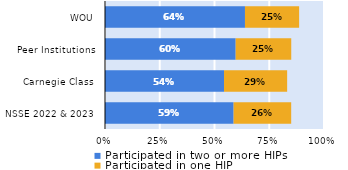
| Category | Participated in two or more HIPs | Participated in one HIP |
|---|---|---|
| NSSE 2022 & 2023 | 0.587 | 0.263 |
| Carnegie Class | 0.543 | 0.288 |
| Peer Institutions | 0.597 | 0.254 |
| WOU | 0.639 | 0.247 |